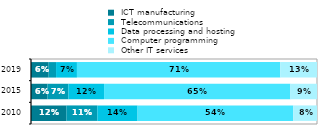
| Category |  ICT manufacturing |  Telecommunications |  Data processing and hosting |  Computer programming |  Other IT services  |
|---|---|---|---|---|---|
| 2010.0 | 0.124 | 0.108 | 0.141 | 0.544 | 0.083 |
| 2015.0 | 0.058 | 0.073 | 0.125 | 0.652 | 0.093 |
| 2019.0 | 0.062 | 0.026 | 0.073 | 0.711 | 0.129 |